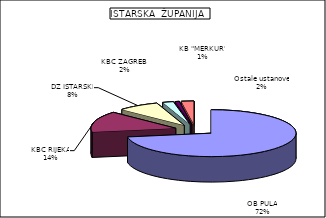
| Category | Series 0 |
|---|---|
| OB PULA | 72.429 |
| KBC RIJEKA | 14.411 |
| DZ ISTARSKI | 7.92 |
| KBC ZAGREB  | 2.062 |
| KB "MERKUR" | 0.79 |
| Ostale ustanove | 2.389 |